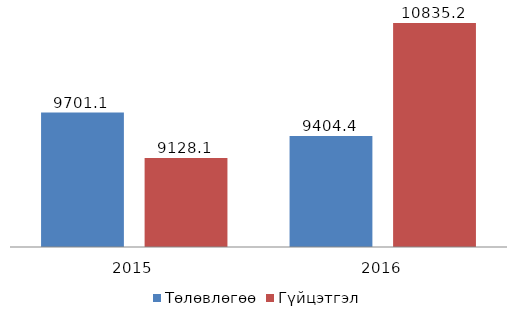
| Category | Төлөвлөгөө | Гүйцэтгэл |
|---|---|---|
| 2015.0 | 9701.1 | 9128.1 |
| 2016.0 | 9404.4 | 10835.2 |